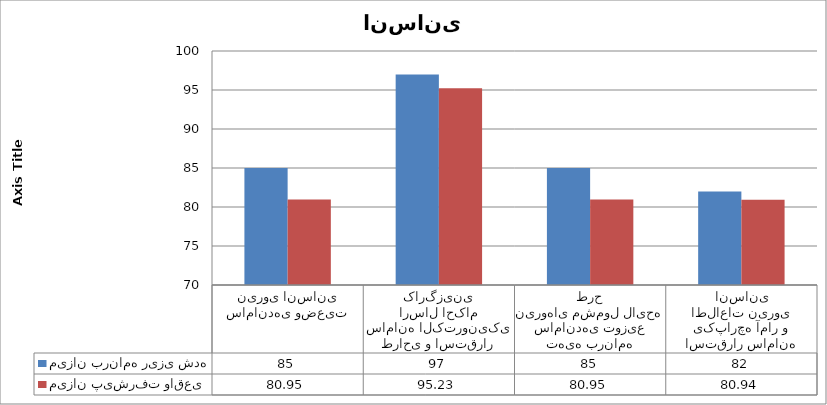
| Category | میزان برنامه ریزی شده | میزان پیشرفت واقعی |
|---|---|---|
| ساماندهی وضعیت نیروی انسانی | 85 | 80.95 |
| طراحی و استقرار سامانه الکترونیکی ارسال احکام کارگزینی | 97 | 95.23 |
| تهیه برنامه ساماندهی توزیع نیروهای مشمول لایحه طرح | 85 | 80.95 |
| استقرار سامانه یکپارچه آمار و اطلاعات نیروی انسانی | 82 | 80.94 |